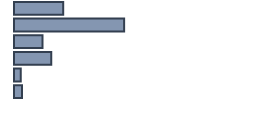
| Category | Percentatge |
|---|---|
| 0 | 20.501 |
| 1 | 45.888 |
| 2 | 11.915 |
| 3 | 15.521 |
| 4 | 2.806 |
| 5 | 3.368 |